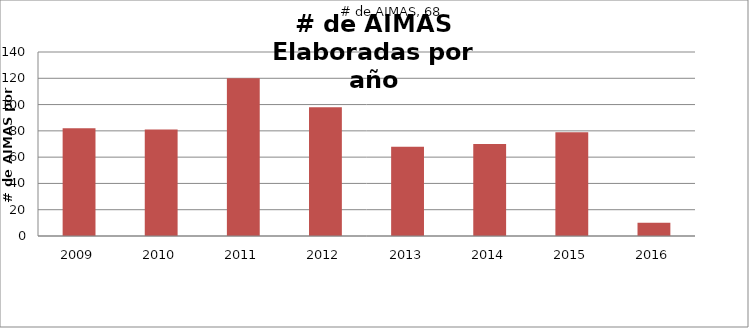
| Category | # de AIMAS |
|---|---|
| 2009.0 | 82 |
| 2010.0 | 81 |
| 2011.0 | 120 |
| 2012.0 | 98 |
| 2013.0 | 68 |
| 2014.0 | 70 |
| 2015.0 | 79 |
| 2016.0 | 10 |